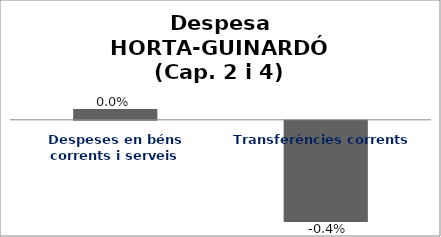
| Category | Series 0 |
|---|---|
| Despeses en béns corrents i serveis | 0 |
| Transferències corrents | -0.004 |